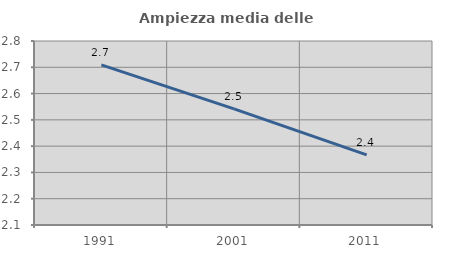
| Category | Ampiezza media delle famiglie |
|---|---|
| 1991.0 | 2.709 |
| 2001.0 | 2.542 |
| 2011.0 | 2.367 |